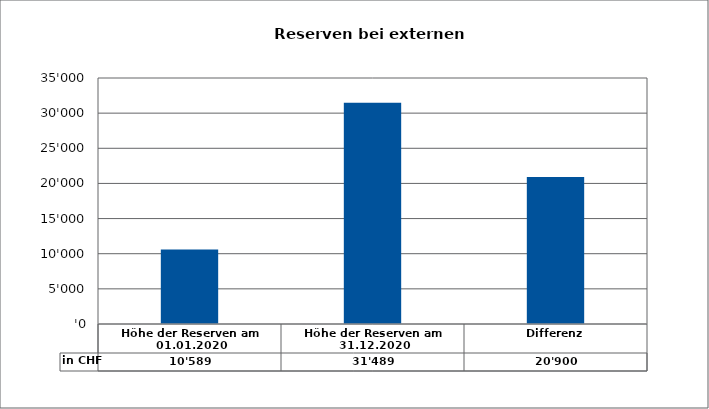
| Category | in CHF |
|---|---|
| Höhe der Reserven am 01.01.2020 | 10589.4 |
| Höhe der Reserven am 31.12.2020 | 31489.01 |
| Differenz | 20899.61 |